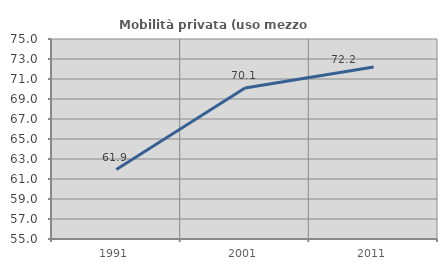
| Category | Mobilità privata (uso mezzo privato) |
|---|---|
| 1991.0 | 61.945 |
| 2001.0 | 70.11 |
| 2011.0 | 72.208 |